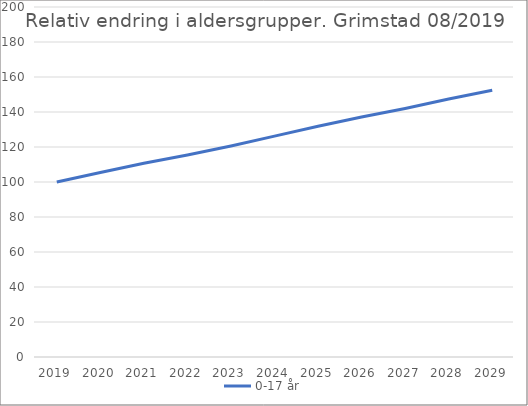
| Category | 0-17 år |
|---|---|
| 2019 | 100 |
| 2020 | 105.391 |
| 2021 | 110.692 |
| 2022 | 115.447 |
| 2023 | 120.541 |
| 2024 | 126.2 |
| 2025 | 131.857 |
| 2026 | 137.112 |
| 2027 | 142.05 |
| 2028 | 147.453 |
| 2029 | 152.464 |